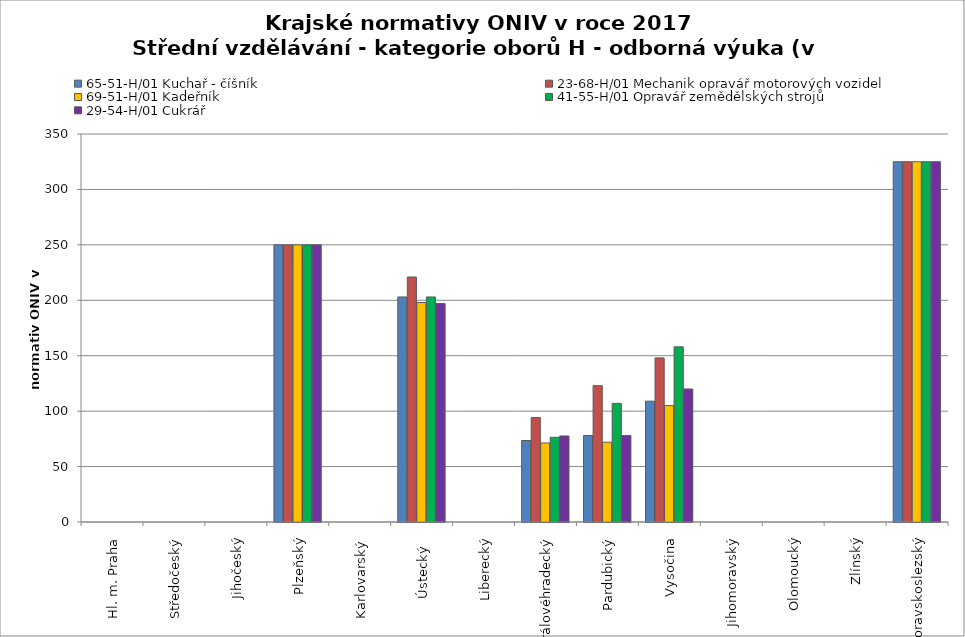
| Category | 65-51-H/01 Kuchař - číšník | 23-68-H/01 Mechanik opravář motorových vozidel | 69-51-H/01 Kadeřník | 41-55-H/01 Opravář zemědělských strojů | 29-54-H/01 Cukrář |
|---|---|---|---|---|---|
| Hl. m. Praha | 0 | 0 | 0 | 0 | 0 |
| Středočeský | 0 | 0 | 0 | 0 | 0 |
| Jihočeský | 0 | 0 | 0 | 0 | 0 |
| Plzeňský | 250 | 250 | 250 | 250 | 250 |
| Karlovarský  | 0 | 0 | 0 | 0 | 0 |
| Ústecký   | 203 | 221 | 198 | 203 | 197 |
| Liberecký | 0 | 0 | 0 | 0 | 0 |
| Královéhradecký | 73.5 | 94.2 | 71.3 | 76.4 | 77.6 |
| Pardubický | 78 | 123 | 72 | 107 | 78 |
| Vysočina | 109 | 148 | 105 | 158 | 120 |
| Jihomoravský | 0 | 0 | 0 | 0 | 0 |
| Olomoucký | 0 | 0 | 0 | 0 | 0 |
| Zlínský | 0 | 0 | 0 | 0 | 0 |
| Moravskoslezský | 325 | 325 | 325 | 325 | 325 |